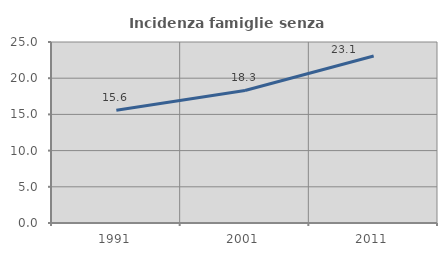
| Category | Incidenza famiglie senza nuclei |
|---|---|
| 1991.0 | 15.57 |
| 2001.0 | 18.309 |
| 2011.0 | 23.058 |